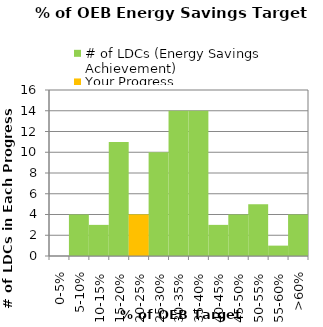
| Category | # of LDCs (Energy Savings Achievement) | Your Progress |
|---|---|---|
| 0-5% | 0 | 0 |
| 5-10% | 4 | 0 |
| 10-15% | 3 | 0 |
| 15-20% | 11 | 0 |
| 20-25% | 4 | 4 |
| 25-30% | 10 | 0 |
| 30-35% | 14 | 0 |
| 35-40% | 14 | 0 |
| 40-45% | 3 | 0 |
| 45-50% | 4 | 0 |
| 50-55% | 5 | 0 |
| 55-60% | 1 | 0 |
| >60% | 4 | 0 |